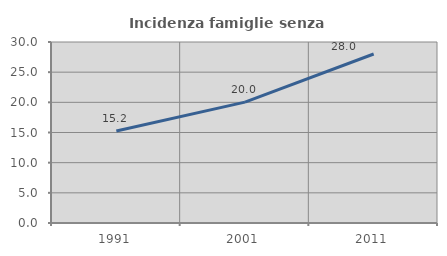
| Category | Incidenza famiglie senza nuclei |
|---|---|
| 1991.0 | 15.237 |
| 2001.0 | 20.034 |
| 2011.0 | 28.015 |